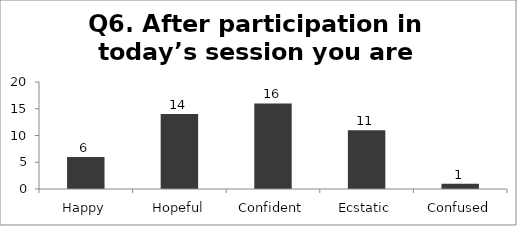
| Category | Q6. After participation in today’s session you are feeling? |
|---|---|
| Happy | 6 |
| Hopeful | 14 |
| Confident | 16 |
| Ecstatic | 11 |
| Confused | 1 |